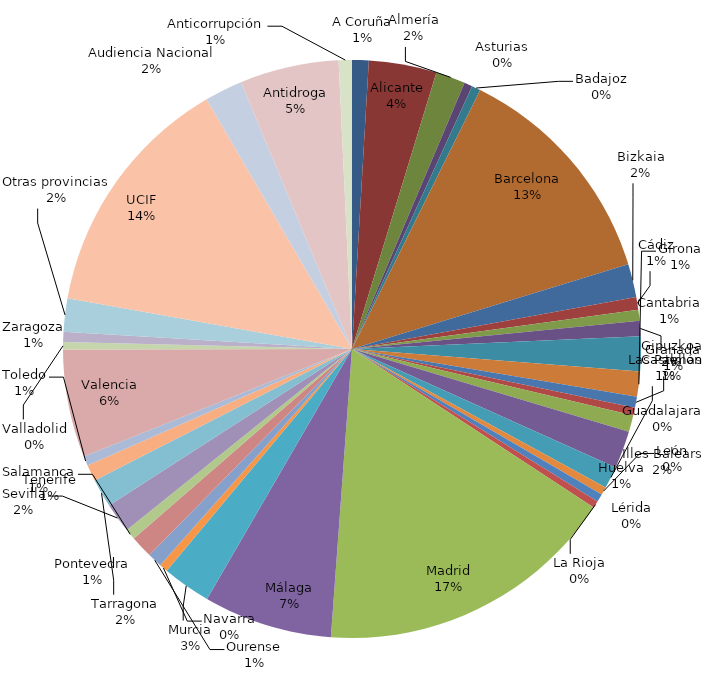
| Category | Comisiones Rogatorias |
|---|---|
| A Coruña | 49 |
| Alicante | 200 |
| Almería | 87 |
| Asturias | 24 |
| Badajoz | 26 |
| Barcelona | 683 |
| Bizkaia | 98 |
| Cádiz | 38 |
| Cantabria | 32 |
| Castellón | 45 |
| Gipuzkoa | 103 |
| Girona | 74 |
| Granada | 32 |
| Guadalajara | 23 |
| Huelva | 49 |
| Illes Balears | 111 |
| Las Palmas | 65 |
| León | 23 |
| Lérida | 24 |
| La Rioja | 21 |
| Madrid | 893 |
| Málaga | 380 |
| Murcia | 143 |
| Navarra | 25 |
| Ourense | 43 |
| Pontevedra | 66 |
| Salamanca | 32 |
| Sevilla | 88 |
| Tarragona | 84 |
| Tenerife | 48 |
| Toledo | 29 |
| Valencia | 318 |
| Valladolid | 22 |
| Zaragoza | 30 |
| Otras provincias | 98 |
| UCIF | 728 |
| Audiencia Nacional | 112 |
| Antidroga | 292 |
| Anticorrupción | 39 |